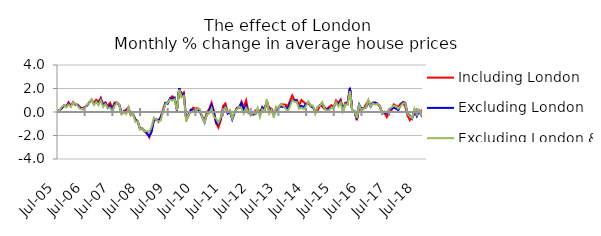
| Category | Including London | Excluding London | Excluding London & SE |
|---|---|---|---|
| 2005-07-01 | 0.004 | -0.027 | 0.069 |
| 2005-08-01 | 0.128 | 0.163 | 0.113 |
| 2005-09-01 | 0.297 | 0.295 | 0.421 |
| 2005-10-01 | 0.584 | 0.545 | 0.585 |
| 2005-11-01 | 0.486 | 0.433 | 0.401 |
| 2005-12-01 | 0.828 | 0.713 | 0.635 |
| 2006-01-01 | 0.509 | 0.504 | 0.432 |
| 2006-02-01 | 0.838 | 0.808 | 0.823 |
| 2006-03-01 | 0.586 | 0.674 | 0.681 |
| 2006-04-01 | 0.628 | 0.563 | 0.509 |
| 2006-05-01 | 0.405 | 0.361 | 0.266 |
| 2006-06-01 | 0.306 | 0.233 | 0.241 |
| 2006-07-01 | 0.429 | 0.392 | 0.321 |
| 2006-08-01 | 0.565 | 0.554 | 0.633 |
| 2006-09-01 | 0.835 | 0.786 | 0.762 |
| 2006-10-01 | 0.993 | 1.028 | 1.077 |
| 2006-11-01 | 0.798 | 0.657 | 0.597 |
| 2006-12-01 | 1.047 | 0.896 | 0.873 |
| 2007-01-01 | 0.861 | 0.675 | 0.579 |
| 2007-02-01 | 1.212 | 1.103 | 1.006 |
| 2007-03-01 | 0.649 | 0.564 | 0.427 |
| 2007-04-01 | 0.826 | 0.759 | 0.678 |
| 2007-05-01 | 0.491 | 0.363 | 0.375 |
| 2007-06-01 | 0.782 | 0.561 | 0.366 |
| 2007-07-01 | 0.32 | 0.1 | 0.07 |
| 2007-08-01 | 0.81 | 0.683 | 0.526 |
| 2007-09-01 | 0.786 | 0.789 | 0.799 |
| 2007-10-01 | 0.574 | 0.623 | 0.585 |
| 2007-11-01 | -0.113 | -0.077 | -0.206 |
| 2007-12-01 | 0.076 | 0.042 | -0.036 |
| 2008-01-01 | 0.196 | 0.057 | -0.181 |
| 2008-02-01 | 0.402 | 0.318 | 0.4 |
| 2008-03-01 | -0.271 | -0.253 | -0.302 |
| 2008-04-01 | -0.188 | -0.2 | -0.142 |
| 2008-05-01 | -0.619 | -0.654 | -0.845 |
| 2008-06-01 | -0.782 | -0.813 | -0.776 |
| 2008-07-01 | -1.451 | -1.459 | -1.469 |
| 2008-08-01 | -1.382 | -1.399 | -1.373 |
| 2008-09-01 | -1.671 | -1.607 | -1.657 |
| 2008-10-01 | -1.826 | -1.814 | -1.615 |
| 2008-11-01 | -2.159 | -2.057 | -1.722 |
| 2008-12-01 | -1.562 | -1.704 | -1.276 |
| 2009-01-01 | -0.738 | -0.696 | -0.476 |
| 2009-02-01 | -0.617 | -0.629 | -0.663 |
| 2009-03-01 | -0.835 | -0.775 | -0.813 |
| 2009-04-01 | -0.421 | -0.427 | -0.719 |
| 2009-05-01 | 0.239 | 0.032 | 0.055 |
| 2009-06-01 | 0.777 | 0.768 | 0.66 |
| 2009-07-01 | 0.802 | 0.701 | 0.8 |
| 2009-08-01 | 1.131 | 1.168 | 1.054 |
| 2009-09-01 | 1.337 | 1.113 | 0.972 |
| 2009-10-01 | 1.165 | 1.217 | 1.097 |
| 2009-11-01 | 0.197 | 0.118 | 0.156 |
| 2009-12-01 | 1.981 | 2.035 | 1.897 |
| 2010-01-01 | 1.519 | 1.363 | 1.249 |
| 2010-02-01 | 1.677 | 1.52 | 1.375 |
| 2010-03-01 | -0.627 | -0.692 | -0.795 |
| 2010-04-01 | -0.325 | -0.232 | -0.266 |
| 2010-05-01 | 0.094 | 0.19 | -0.033 |
| 2010-06-01 | 0.367 | 0.159 | 0.081 |
| 2010-07-01 | 0.291 | 0.119 | -0.034 |
| 2010-08-01 | 0.34 | 0.264 | 0.318 |
| 2010-09-01 | -0.022 | 0.097 | 0.241 |
| 2010-10-01 | -0.376 | -0.435 | -0.41 |
| 2010-11-01 | -0.713 | -0.899 | -0.896 |
| 2010-12-01 | 0.005 | -0.185 | -0.217 |
| 2011-01-01 | 0.246 | 0.156 | -0.125 |
| 2011-02-01 | 0.789 | 0.605 | 0.302 |
| 2011-03-01 | 0.128 | -0.038 | -0.411 |
| 2011-04-01 | -0.968 | -0.9 | -0.557 |
| 2011-05-01 | -1.323 | -1.037 | -0.907 |
| 2011-06-01 | -0.728 | -0.567 | -0.453 |
| 2011-07-01 | 0.512 | 0.242 | 0.099 |
| 2011-08-01 | 0.726 | 0.47 | 0.393 |
| 2011-09-01 | -0.007 | -0.138 | -0.009 |
| 2011-10-01 | 0.137 | 0.027 | 0.156 |
| 2011-11-01 | -0.567 | -0.635 | -0.55 |
| 2011-12-01 | 0.039 | -0.073 | 0.07 |
| 2012-01-01 | 0.326 | 0.325 | 0.217 |
| 2012-02-01 | 0.35 | 0.447 | 0.451 |
| 2012-03-01 | 0.876 | 0.755 | 0.302 |
| 2012-04-01 | 0.41 | 0.073 | -0.137 |
| 2012-05-01 | 0.988 | 0.555 | 0.346 |
| 2012-06-01 | 0.006 | -0.081 | 0.004 |
| 2012-07-01 | -0.085 | -0.158 | -0.308 |
| 2012-08-01 | -0.229 | -0.157 | -0.058 |
| 2012-09-01 | 0.128 | -0.186 | -0.139 |
| 2012-10-01 | 0.179 | 0.172 | 0.344 |
| 2012-11-01 | 0.065 | -0.249 | -0.418 |
| 2012-12-01 | 0.317 | 0.405 | 0.234 |
| 2013-01-01 | 0.353 | 0.115 | 0.095 |
| 2013-02-01 | 0.856 | 0.948 | 1.094 |
| 2013-03-01 | 0.386 | 0.079 | -0.146 |
| 2013-04-01 | 0.274 | 0.196 | 0.178 |
| 2013-05-01 | -0.099 | -0.23 | -0.468 |
| 2013-06-01 | 0.123 | 0.165 | 0.449 |
| 2013-07-01 | 0.372 | 0.338 | 0.307 |
| 2013-08-01 | 0.658 | 0.477 | 0.683 |
| 2013-09-01 | 0.643 | 0.413 | 0.532 |
| 2013-10-01 | 0.632 | 0.433 | 0.308 |
| 2013-11-01 | 0.471 | 0.192 | 0.067 |
| 2013-12-01 | 0.925 | 0.764 | 0.46 |
| 2014-01-01 | 1.406 | 1.032 | 0.997 |
| 2014-02-01 | 0.988 | 1.004 | 0.876 |
| 2014-03-01 | 1.041 | 0.92 | 0.836 |
| 2014-04-01 | 0.572 | 0.382 | 0.28 |
| 2014-05-01 | 1.019 | 0.524 | 0.359 |
| 2014-06-01 | 0.845 | 0.427 | 0.25 |
| 2014-07-01 | 0.633 | 0.685 | 0.514 |
| 2014-08-01 | 0.738 | 0.819 | 0.897 |
| 2014-09-01 | 0.591 | 0.475 | 0.536 |
| 2014-10-01 | 0.374 | 0.403 | 0.543 |
| 2014-11-01 | 0.005 | -0.008 | -0.158 |
| 2014-12-01 | 0.104 | 0.388 | 0.438 |
| 2015-01-01 | 0.566 | 0.596 | 0.531 |
| 2015-02-01 | 0.477 | 0.712 | 0.845 |
| 2015-03-01 | 0.246 | 0.42 | 0.32 |
| 2015-04-01 | 0.268 | 0.15 | 0.11 |
| 2015-05-01 | 0.427 | 0.324 | 0.171 |
| 2015-06-01 | 0.575 | 0.356 | 0.37 |
| 2015-07-01 | 0.419 | 0.456 | 0.42 |
| 2015-08-01 | 0.978 | 0.742 | 0.82 |
| 2015-09-01 | 0.752 | 0.658 | 0.479 |
| 2015-10-01 | 1.06 | 0.93 | 0.809 |
| 2015-11-01 | 0.234 | 0.111 | -0.034 |
| 2015-12-01 | 0.779 | 0.71 | 0.654 |
| 2016-01-01 | 0.813 | 0.679 | 0.611 |
| 2016-02-01 | 2.068 | 2.04 | 1.776 |
| 2016-03-01 | 0.187 | 0.064 | 0.072 |
| 2016-04-01 | -0.005 | 0.068 | 0.11 |
| 2016-05-01 | -0.701 | -0.612 | -0.52 |
| 2016-06-01 | 0.306 | 0.646 | 0.59 |
| 2016-07-01 | 0.133 | 0.264 | 0.142 |
| 2016-08-01 | 0.302 | 0.34 | 0.298 |
| 2016-09-01 | 0.654 | 0.381 | 0.399 |
| 2016-10-01 | 0.961 | 0.856 | 1.037 |
| 2016-11-01 | 0.631 | 0.45 | 0.474 |
| 2016-12-01 | 0.74 | 0.804 | 0.725 |
| 2017-01-01 | 0.814 | 0.789 | 0.628 |
| 2017-02-01 | 0.635 | 0.713 | 0.692 |
| 2017-03-01 | 0.54 | 0.428 | 0.482 |
| 2017-04-01 | -0.037 | -0.152 | -0.137 |
| 2017-05-01 | -0.078 | -0.002 | 0.042 |
| 2017-06-01 | -0.436 | -0.144 | -0.046 |
| 2017-07-01 | -0.095 | 0.174 | 0.246 |
| 2017-08-01 | 0.109 | 0.29 | 0.391 |
| 2017-09-01 | 0.649 | 0.362 | 0.529 |
| 2017-10-01 | 0.521 | 0.285 | 0.485 |
| 2017-11-01 | 0.456 | 0.153 | 0.282 |
| 2017-12-01 | 0.713 | 0.592 | 0.514 |
| 2018-01-01 | 0.803 | 0.834 | 0.733 |
| 2018-02-01 | 0.453 | 0.79 | 0.749 |
| 2018-03-01 | -0.312 | -0.12 | -0.154 |
| 2018-04-01 | -0.694 | -0.291 | -0.357 |
| 2018-05-01 | -0.461 | -0.561 | -0.524 |
| 2018-06-01 | -0.152 | 0.162 | 0.269 |
| 2018-07-01 | -0.239 | -0.354 | -0.206 |
| 2018-08-01 | 0.115 | 0.08 | 0.178 |
| 2018-09-01 | -0.036 | -0.281 | -0.211 |
| 2018-10-01 | 0.477 | 0.221 | 0.283 |
| 2018-11-01 | 0.24 | 0.108 | 0.181 |